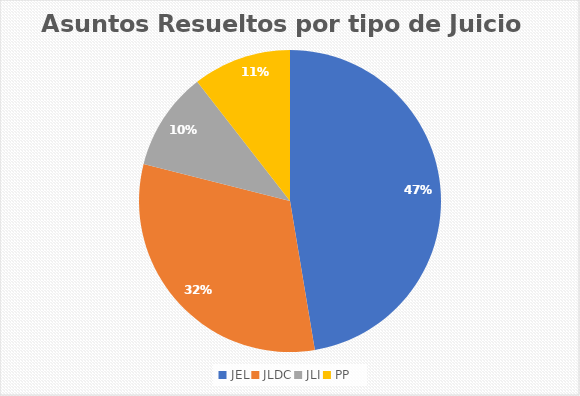
| Category | Rubro Cantidad |
|---|---|
| JEL | 9 |
| JLDC | 6 |
| JLI | 2 |
| PP | 2 |